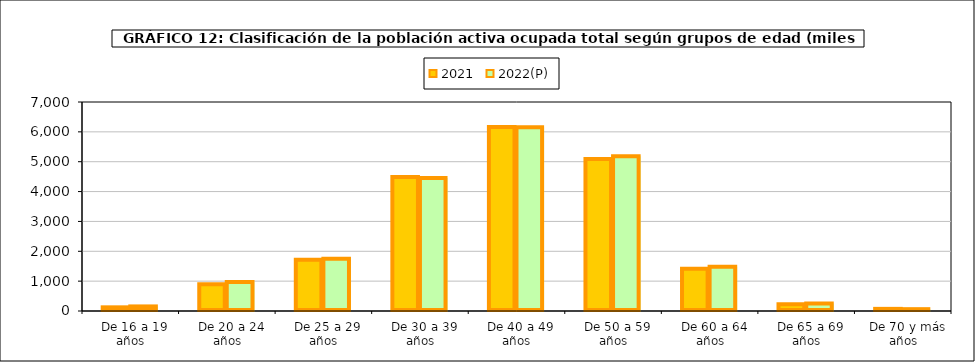
| Category | 2021 | 2022(P) |
|---|---|---|
|   De 16 a 19 años | 122.9 | 153.4 |
|   De 20 a 24 años | 898.7 | 968.6 |
|   De 25 a 29 años | 1713.6 | 1753.1 |
|   De 30 a 39 años | 4484.2 | 4457 |
|   De 40 a 49 años | 6165.6 | 6153.8 |
|   De 50 a 59 años | 5088.2 | 5184.5 |
|   De 60 a 64 años | 1411.7 | 1478.2 |
|   De 65 a 69 años | 228.7 | 253.7 |
|   De 70 y más años | 71.4 | 61.5 |